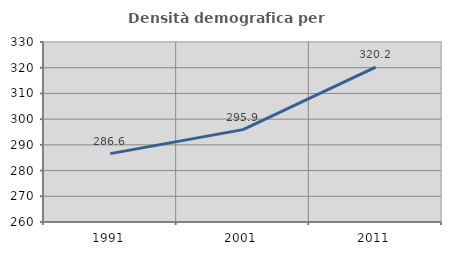
| Category | Densità demografica |
|---|---|
| 1991.0 | 286.595 |
| 2001.0 | 295.919 |
| 2011.0 | 320.198 |